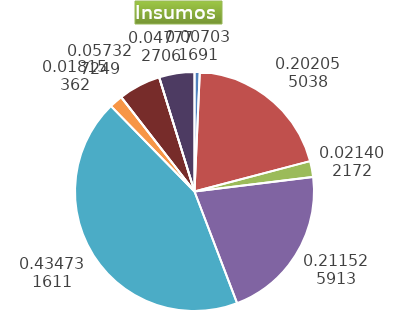
| Category | Series 0 |
|---|---|
| Control arvenses | 795879 |
| Control fitosanitario | 22869516 |
| Cosecha y beneficio | 2422395.948 |
| Fertilización | 23941473 |
| Instalación | 49204917.687 |
| Otros | 2054710 |
| Podas | 0 |
| Riego | 6488561 |
| Transporte | 0 |
| Tutorado | 5407134 |